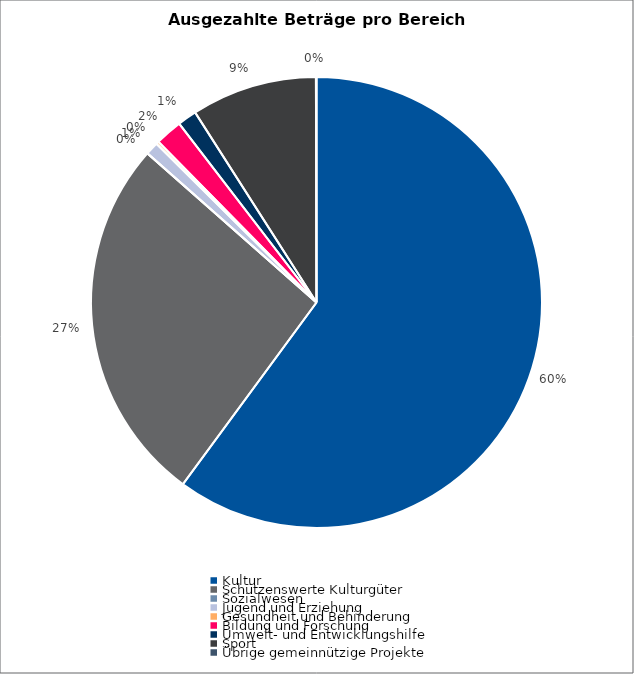
| Category | Series 0 |
|---|---|
| Kultur | 6902440 |
| Schützenswerte Kulturgüter | 3034350 |
| Sozialwesen | 0 |
| Jugend und Erziehung | 107200 |
| Gesundheit und Behinderung | 22000 |
| Bildung und Forschung | 224000 |
| Umwelt- und Entwicklungshilfe | 158123 |
| Sport | 1034250 |
| Übrige gemeinnützige Projekte | 5000 |